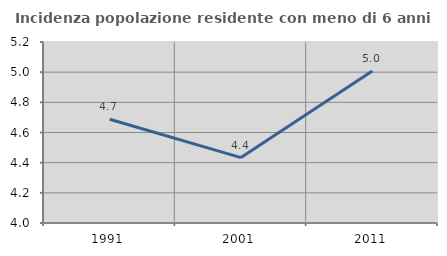
| Category | Incidenza popolazione residente con meno di 6 anni |
|---|---|
| 1991.0 | 4.688 |
| 2001.0 | 4.433 |
| 2011.0 | 5.008 |